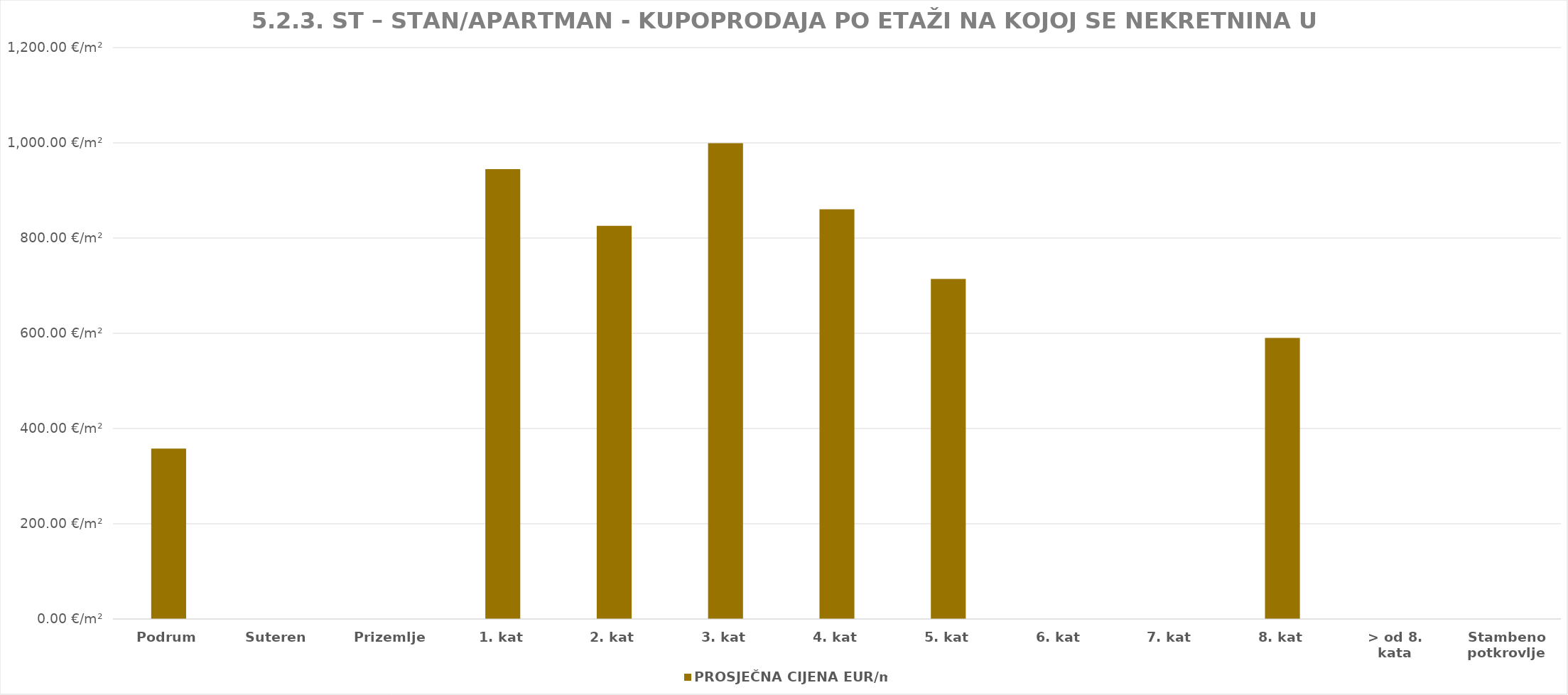
| Category | PROSJEČNA CIJENA EUR/m2 |
|---|---|
| Podrum | 1900-12-22 15:41:27 |
| Suteren  | 0 |
| Prizemlje | 0 |
| 1. kat | 1902-08-01 14:38:58 |
| 2. kat | 1902-04-04 16:13:49 |
| 3. kat | 1902-09-25 02:01:00 |
| 4. kat | 1902-05-09 07:25:08 |
| 5. kat | 1901-12-14 02:46:35 |
| 6. kat | 0 |
| 7. kat | 0 |
| 8. kat | 1901-08-12 04:39:53 |
| > od 8. kata | 0 |
| Stambeno potkrovlje | 0 |